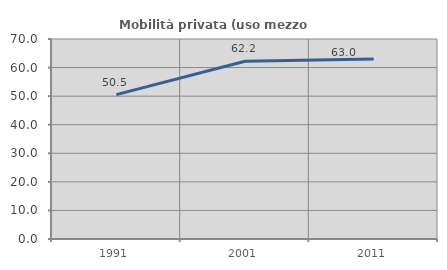
| Category | Mobilità privata (uso mezzo privato) |
|---|---|
| 1991.0 | 50.518 |
| 2001.0 | 62.219 |
| 2011.0 | 62.993 |